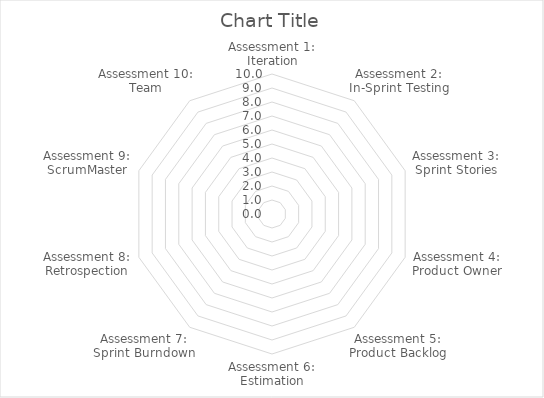
| Category | Series 0 |
|---|---|
| Assessment 1: Iteration | 0 |
| Assessment 2: In-Sprint Testing | 0 |
| Assessment 3: Sprint Stories | 0 |
| Assessment 4: Product Owner | 0 |
| Assessment 5: Product Backlog | 0 |
| Assessment 6: Estimation | 0 |
| Assessment 7: Sprint Burndown | 0 |
| Assessment 8: Retrospection | 0 |
| Assessment 9: ScrumMaster | 0 |
| Assessment 10: Team | 0 |